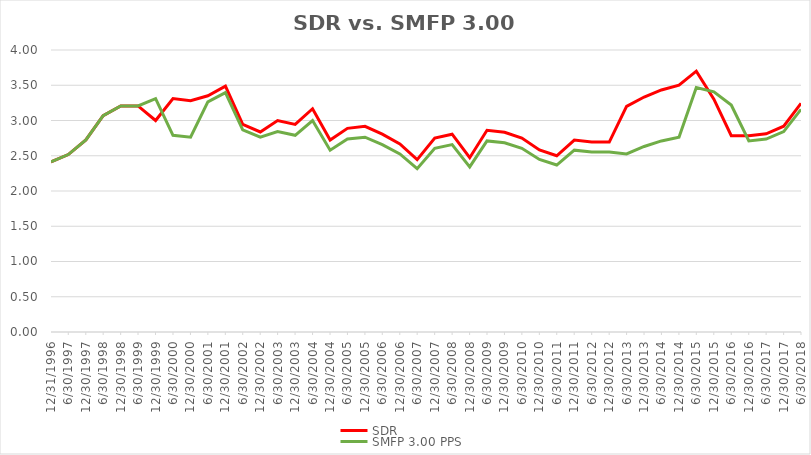
| Category | SDR | SMFP 3.00 PPS |
|---|---|---|
| 12/31/96 | 2.414 | 2.414 |
| 6/30/97 | 2.517 | 2.517 |
| 12/31/97 | 2.724 | 2.724 |
| 6/30/98 | 3.069 | 3.069 |
| 12/31/98 | 3.207 | 3.207 |
| 6/30/99 | 3.207 | 3.207 |
| 12/31/99 | 3 | 3.31 |
| 6/30/00 | 3.312 | 2.789 |
| 12/31/00 | 3.281 | 2.763 |
| 6/30/01 | 3.351 | 3.263 |
| 12/31/01 | 3.486 | 3.395 |
| 6/30/02 | 2.946 | 2.868 |
| 12/31/02 | 2.838 | 2.763 |
| 6/30/03 | 3 | 2.842 |
| 12/31/03 | 2.944 | 2.789 |
| 6/30/04 | 3.167 | 3 |
| 12/31/04 | 2.722 | 2.579 |
| 6/30/05 | 2.889 | 2.737 |
| 12/31/05 | 2.917 | 2.763 |
| 6/30/06 | 2.806 | 2.658 |
| 12/31/06 | 2.667 | 2.526 |
| 6/30/07 | 2.444 | 2.316 |
| 12/31/07 | 2.75 | 2.605 |
| 6/30/08 | 2.806 | 2.658 |
| 12/31/08 | 2.472 | 2.342 |
| 6/30/09 | 2.861 | 2.711 |
| 12/31/09 | 2.833 | 2.684 |
| 6/30/10 | 2.75 | 2.605 |
| 12/31/10 | 2.583 | 2.447 |
| 6/30/11 | 2.5 | 2.368 |
| 12/31/11 | 2.722 | 2.579 |
| 6/30/12 | 2.694 | 2.553 |
| 12/31/12 | 2.694 | 2.553 |
| 6/30/13 | 3.2 | 2.526 |
| 12/31/13 | 3.333 | 2.632 |
| 6/30/14 | 3.433 | 2.711 |
| 12/31/14 | 3.5 | 2.763 |
| 6/30/15 | 3.7 | 3.469 |
| 12/31/15 | 3.303 | 3.406 |
| 6/30/16 | 2.784 | 3.219 |
| 12/31/16 | 2.784 | 2.711 |
| 6/30/17 | 2.811 | 2.737 |
| 12/31/17 | 2.919 | 2.842 |
| 6/30/18 | 3.243 | 3.158 |